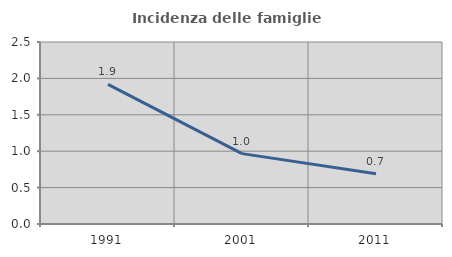
| Category | Incidenza delle famiglie numerose |
|---|---|
| 1991.0 | 1.917 |
| 2001.0 | 0.967 |
| 2011.0 | 0.69 |